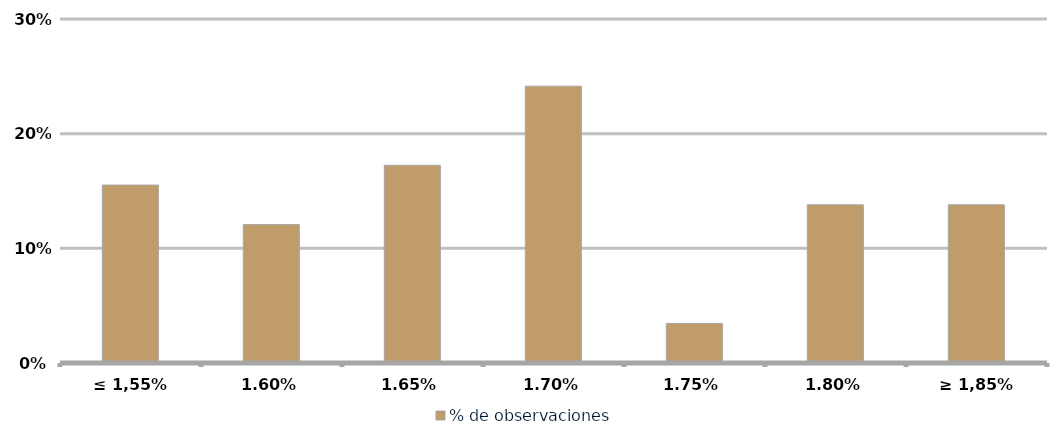
| Category | % de observaciones  |
|---|---|
| ≤ 1,55% | 0.155 |
| 1,60% | 0.121 |
| 1,65% | 0.172 |
| 1,70% | 0.241 |
| 1,75% | 0.034 |
| 1,80% | 0.138 |
| ≥ 1,85% | 0.138 |